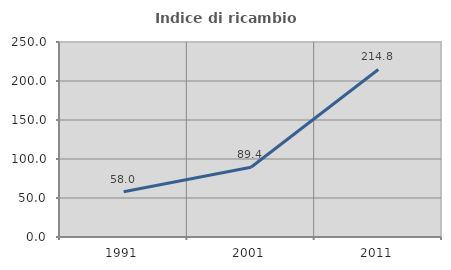
| Category | Indice di ricambio occupazionale  |
|---|---|
| 1991.0 | 57.955 |
| 2001.0 | 89.412 |
| 2011.0 | 214.815 |